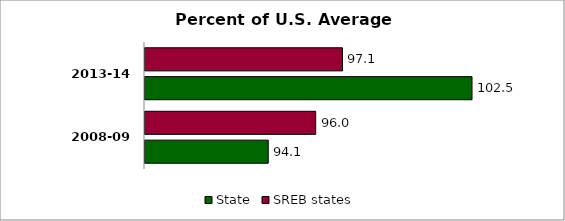
| Category | State | SREB states |
|---|---|---|
| 2008-09 | 94.082 | 96.038 |
| 2013-14 | 102.486 | 97.144 |